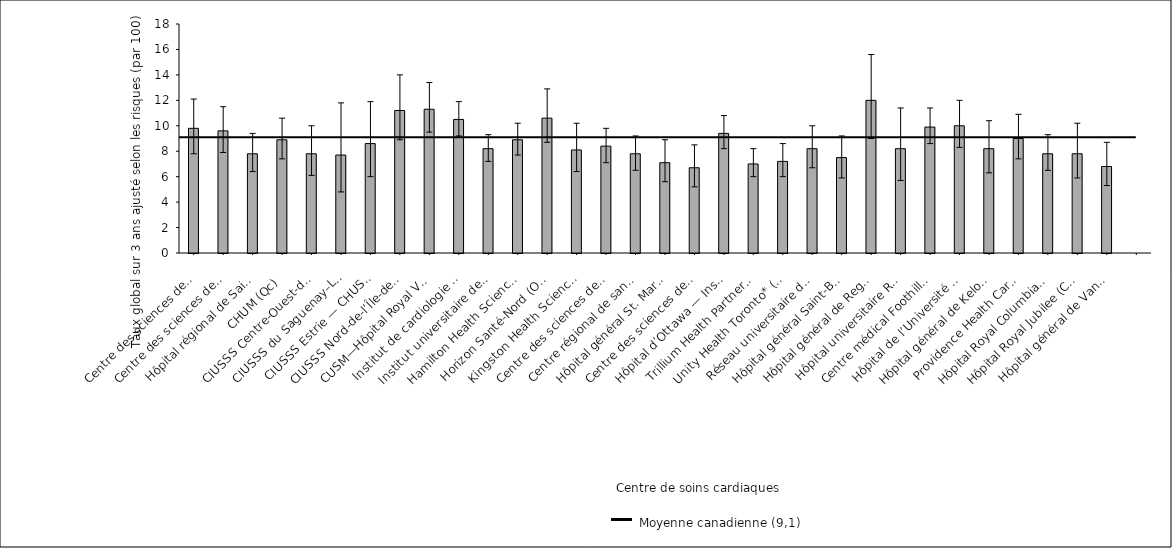
| Category | Taux ajusté selon les risques |
|---|---|
| Centre des sciences de la santé — St. John’s (T. -N.-L.) | 9.8 |
| Centre des sciences de la santé Queen Elizabeth II (N.-É.) | 9.6 |
| Hôpital régional de Saint John (N.-B.) | 7.8 |
| CHUM (Qc) | 8.9 |
| CIUSSS Centre-Ouest-de-l’Île-de-Mtl—Hôpital général juif (Qc) | 7.8 |
| CIUSSS du Saguenay–Lac-St-Jean—Hôpital de Chicoutimi (Qc) | 7.7 |
| CIUSSS Estrie — CHUS—Hôpital Fleurimont (Qc) | 8.6 |
| CIUSSS Nord-de-l’Île-de-Montréal—Hôpital du Sacré-Cœur de Montréal (Qc) | 11.2 |
| CUSM—Hôpital Royal Victoria* (Qc) | 11.3 |
| Institut de cardiologie de Montréal* (Qc) | 10.5 |
| Institut universitaire de cardiologie et pneumologie de Québec (Qc) | 8.2 |
| Hamilton Health Sciences (Ont.) | 8.9 |
| Horizon Santé-Nord (Ont.) | 10.6 |
| Kingston Health Sciences Centre (Ont.) | 8.1 |
| Centre des sciences de la santé de London (Ont.) | 8.4 |
| Centre régional de santé Southlake (Ont.) | 7.8 |
| Hôpital général St. Mary’s* (Ont.) | 7.1 |
| Centre des sciences de la santé Sunnybrook* (Ont.) | 6.7 |
| Hôpital d’Ottawa — Institut de cardiologie de l’Université d’Ottawa (Ont.) | 9.4 |
| Trillium Health Partners* (Ont.) | 7 |
| Unity Health Toronto* (Ont.) | 7.2 |
| Réseau universitaire de santé (Ont.) | 8.2 |
| Hôpital général Saint-Boniface (Man.) | 7.5 |
| Hôpital général de Regina (Sask.) | 12 |
| Hôpital universitaire Royal (Sask.) | 8.2 |
| Centre médical Foothills (Alb.) | 9.9 |
| Hôpital de l’Université de l’Alberta (Alb.) | 10 |
| Hôpital général de Kelowna (C.-B.) | 8.2 |
| Providence Health Care — Hôpital St. Paul’s (Vancouver) (C.-B.) | 9 |
| Hôpital Royal Columbian (C.-B.) | 7.8 |
| Hôpital Royal Jubilee (C.-B.) | 7.8 |
| Hôpital général de Vancouver* (C.-B.) | 6.8 |